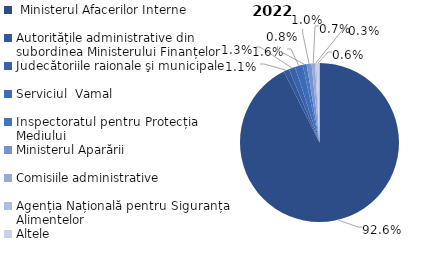
| Category | Series 0 |
|---|---|
|  Ministerul Afacerilor Interne | 0.926 |
| Autoritățile administrative din subordinea Ministerului Finanțelor | 0.011 |
| Judecătoriile raionale şi municipale | 0.013 |
| Serviciul  Vamal | 0.016 |
| Inspectoratul pentru Protecția Mediului | 0.008 |
| Ministerul Aparării | 0.01 |
| Comisiile administrative | 0.007 |
| Agenția Națională pentru Siguranța Alimentelor | 0.003 |
| Altele | 0.006 |